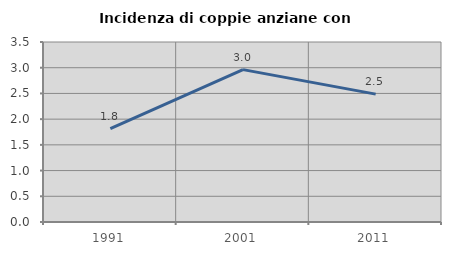
| Category | Incidenza di coppie anziane con figli |
|---|---|
| 1991.0 | 1.815 |
| 2001.0 | 2.963 |
| 2011.0 | 2.487 |